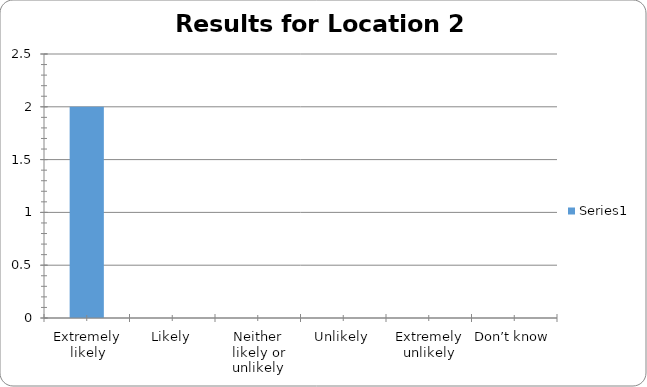
| Category | Series 0 |
|---|---|
| Extremely likely | 2 |
| Likely | 0 |
| Neither likely or unlikely | 0 |
| Unlikely | 0 |
| Extremely unlikely | 0 |
| Don’t know | 0 |